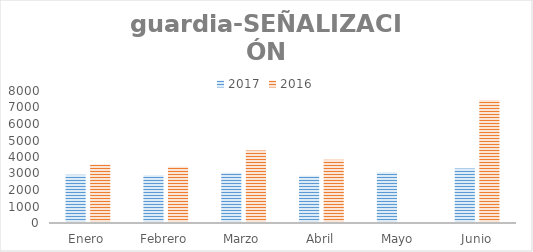
| Category | 2017 | 2016 |
|---|---|---|
| Enero | 2920 | 3538 |
| Febrero | 2891 | 3403 |
| Marzo | 3039 | 4388 |
| Abril | 2862 | 3832 |
| Mayo | 3074 | 0 |
| Junio | 3307 | 7458 |